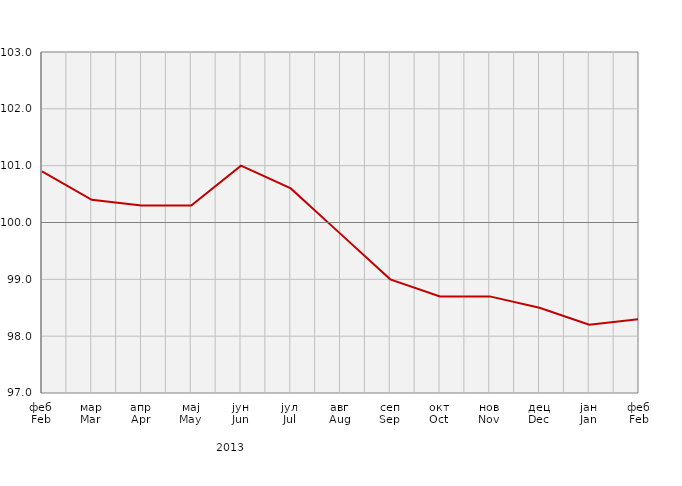
| Category | Индекси потрошачких цијена
Consumer price indices |
|---|---|
| феб
Feb | 100.9 |
| мар
Mar | 100.4 |
| апр
Apr | 100.3 |
| мај
May | 100.3 |
| јун
Jun | 101 |
| јул
Jul | 100.6 |
| авг
Aug | 99.8 |
| сеп
Sep | 99 |
| окт
Oct | 98.7 |
| нов
Nov | 98.7 |
| дец
Dec | 98.5 |
| јан
Jan | 98.2 |
| феб
Feb | 98.3 |